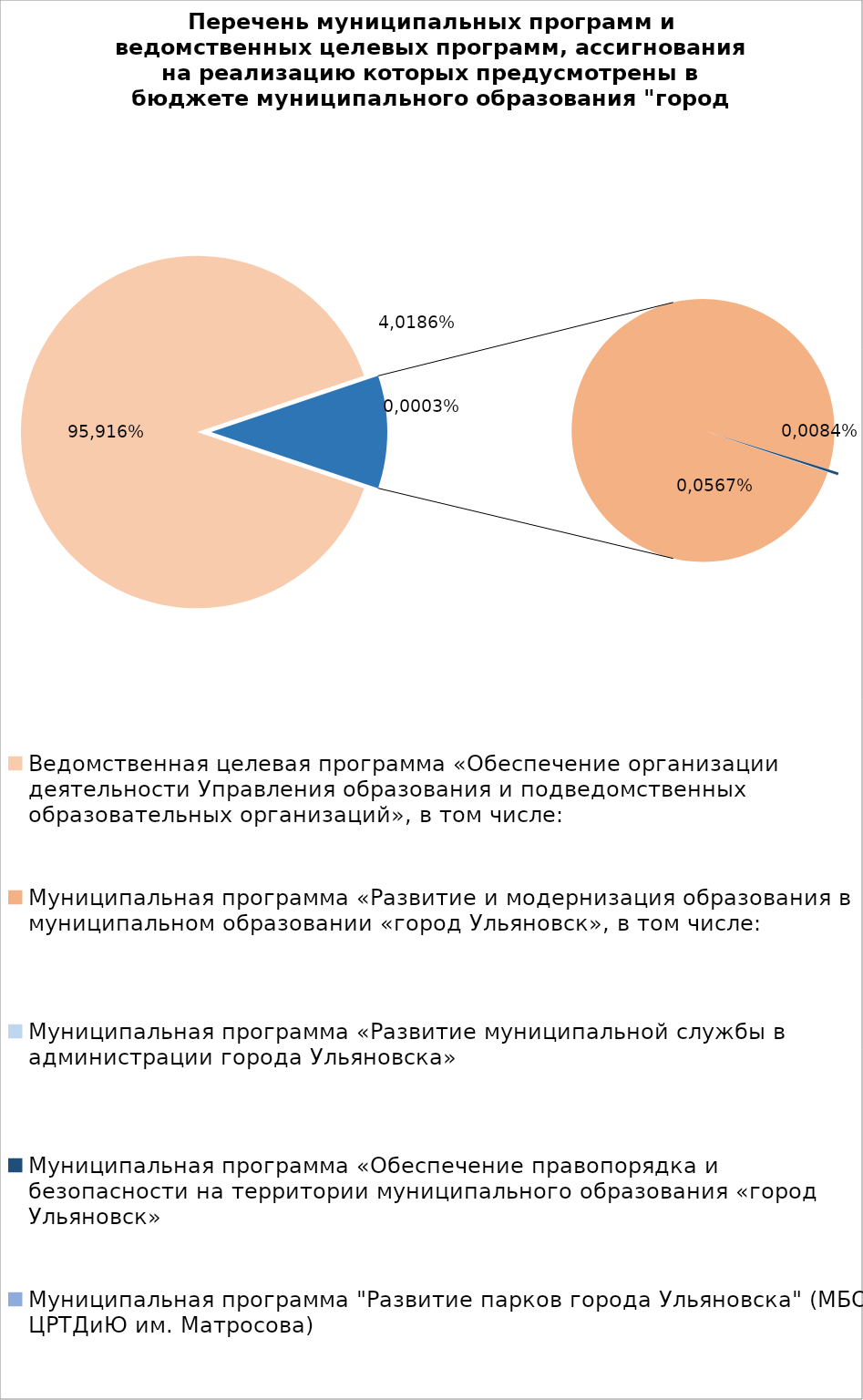
| Category | Series 0 |
|---|---|
| Ведомственная целевая программа «Обеспечение организации деятельности Управления образования и подведомственных образовательных организаций», в том числе: | 6961826.91 |
| Муниципальная программа «Развитие и модернизация образования в муниципальном образовании «город Ульяновск», в том числе: | 799644.04 |
| Муниципальная программа «Развитие муниципальной службы в администрации города Ульяновска» | 14.3 |
| Муниципальная программа «Обеспечение правопорядка и безопасности на территории муниципального образования «город Ульяновск» | 2700 |
| Муниципальная программа "Развитие парков города Ульяновска" (МБОУ ЦРТДиЮ им. Матросова) | 400 |